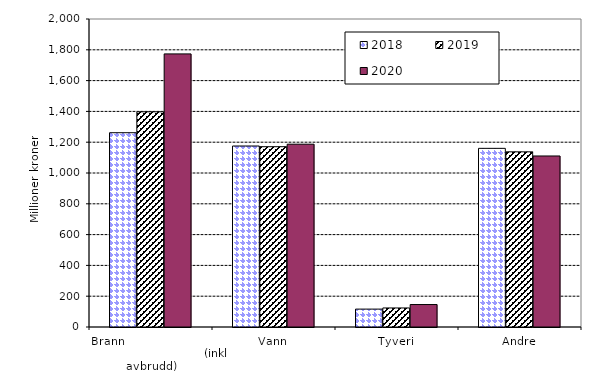
| Category | 2018 | 2019 | 2020 |
|---|---|---|---|
| Brann                                                       (inkl avbrudd) | 1261.6 | 1397.416 | 1773.396 |
| Vann | 1175.316 | 1170.779 | 1187.007 |
| Tyveri | 116.186 | 123.671 | 145.838 |
| Andre | 1160.015 | 1137.426 | 1110.581 |